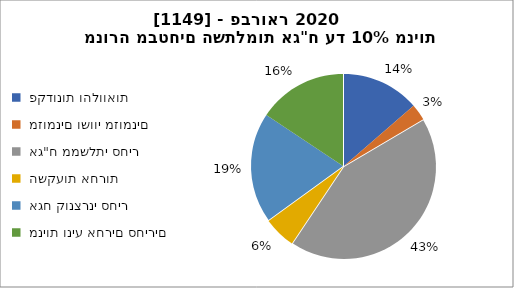
| Category | מנורה מבטחים השתלמות אג"ח עד 10% מניות [1149] - פברואר 2020 |
|---|---|
|  פקדונות והלוואות  | 264137 |
|  מזומנים ושווי מזומנים   | 56171 |
|  אג"ח ממשלתי סחיר  | 829390 |
|  השקעות אחרות  | 109126 |
|  אגח קונצרני סחיר  | 374380 |
|  מניות וניע אחרים סחירים   | 303434 |